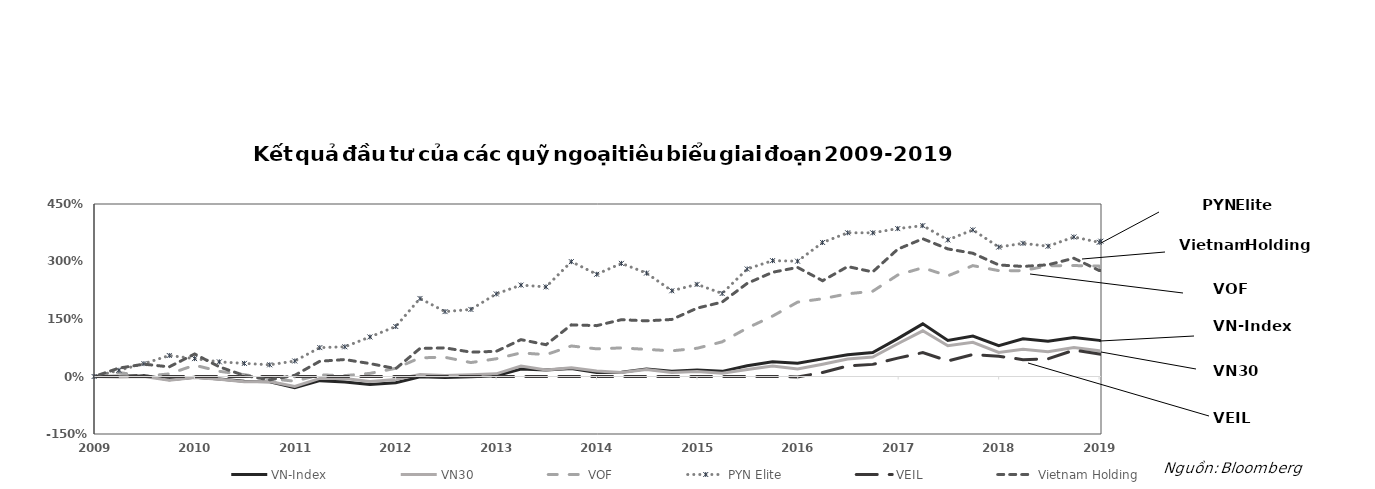
| Category | VN-Index | VN30 | VOF | PYN Elite | VEIL | Vietnam Holding |
|---|---|---|---|---|---|---|
| 2020-01-06 | 0.932 | 0.659 | 2.799 | 3.53 | 0.581 | 2.764 |
| 2019-12-31 | 0.942 | 0.671 | 2.88 | 3.5 | 0.589 | 2.764 |
| 2019-09-30 | 1.014 | 0.755 | 2.895 | 3.64 | 0.688 | 3.085 |
| 2019-06-28 | 0.92 | 0.643 | 2.889 | 3.398 | 0.46 | 2.914 |
| 2019-03-29 | 0.982 | 0.711 | 2.761 | 3.474 | 0.44 | 2.871 |
| 2018-12-31 | 0.804 | 0.626 | 2.761 | 3.376 | 0.53 | 2.91 |
| 2018-09-28 | 1.056 | 0.891 | 2.892 | 3.825 | 0.574 | 3.215 |
| 2018-06-29 | 0.942 | 0.802 | 2.625 | 3.563 | 0.406 | 3.328 |
| 2018-03-30 | 1.374 | 1.192 | 2.838 | 3.936 | 0.624 | 3.593 |
| 2017-12-29 | 0.989 | 0.855 | 2.648 | 3.858 | 0.478 | 3.321 |
| 2017-09-29 | 0.626 | 0.507 | 2.224 | 3.748 | 0.316 | 2.728 |
| 2017-06-30 | 0.569 | 0.455 | 2.157 | 3.749 | 0.276 | 2.868 |
| 2017-03-31 | 0.46 | 0.318 | 2.028 | 3.496 | 0.105 | 2.498 |
| 2016-12-30 | 0.344 | 0.194 | 1.94 | 3.008 | -0.01 | 2.846 |
| 2016-09-30 | 0.386 | 0.271 | 1.575 | 3.022 | 0 | 2.719 |
| 2016-06-30 | 0.278 | 0.182 | 1.264 | 2.805 | 0 | 2.43 |
| 2016-03-31 | 0.134 | 0.087 | 0.904 | 2.165 | 0 | 1.942 |
| 2015-12-31 | 0.17 | 0.132 | 0.737 | 2.403 | 0 | 1.783 |
| 2015-09-30 | 0.137 | 0.103 | 0.67 | 2.237 | 0 | 1.488 |
| 2015-06-30 | 0.199 | 0.183 | 0.708 | 2.698 | 0 | 1.452 |
| 2015-03-31 | 0.114 | 0.103 | 0.746 | 2.951 | 0 | 1.482 |
| 2014-12-31 | 0.103 | 0.144 | 0.722 | 2.667 | 0 | 1.327 |
| 2014-09-30 | 0.21 | 0.225 | 0.796 | 2.996 | 0 | 1.347 |
| 2014-06-30 | 0.168 | 0.169 | 0.569 | 2.337 | 0 | 0.829 |
| 2014-03-31 | 0.196 | 0.275 | 0.616 | 2.385 | 0 | 0.962 |
| 2013-12-31 | 0.02 | 0.069 | 0.462 | 2.154 | 0 | 0.656 |
| 2013-09-30 | -0.004 | 0.049 | 0.363 | 1.75 | 0 | 0.636 |
| 2013-06-28 | -0.028 | 0.024 | 0.502 | 1.693 | 0 | 0.747 |
| 2013-03-29 | -0.008 | 0.05 | 0.488 | 2.036 | 0 | 0.732 |
| 2012-12-31 | -0.164 | -0.077 | 0.214 | 1.304 | 0 | 0.205 |
| 2012-09-28 | -0.207 | -0.132 | 0.081 | 1.031 | 0 | 0.337 |
| 2012-06-29 | -0.146 | -0.054 | 0.023 | 0.775 | 0 | 0.442 |
| 2012-03-30 | -0.109 | -0.049 | 0.043 | 0.753 | 0 | 0.398 |
| 2011-12-30 | -0.289 | -0.261 | -0.121 | 0.405 | 0 | 0.031 |
| 2011-09-30 | -0.136 | -0.133 | -0.057 | 0.305 | 0 | -0.088 |
| 2011-06-30 | -0.126 | -0.135 | 0.048 | 0.342 | 0 | 0.025 |
| 2011-03-31 | -0.068 | -0.07 | 0.135 | 0.382 | 0 | 0.252 |
| 2010-12-31 | -0.02 | -0.024 | 0.296 | 0.467 | 0 | 0.588 |
| 2010-09-30 | -0.081 | -0.099 | 0.068 | 0.548 | 0 | 0.251 |
| 2010-06-30 | 0.025 | -0.002 | 0.006 | 0.336 | 0 | 0.322 |
| 2010-03-31 | 0.009 | -0.011 | 0.105 | 0.162 | 0 | 0.218 |
| 2009-12-31 | 0 | 0 | 0 | 0 | 0 | 0 |